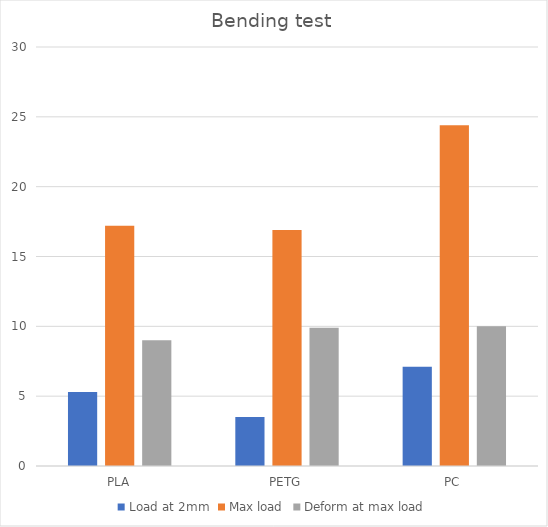
| Category | Load at 2mm | Max load | Deform at max load |
|---|---|---|---|
| PLA | 5.3 | 17.2 | 9 |
| PETG | 3.5 | 16.9 | 9.9 |
| PC | 7.1 | 24.4 | 10 |